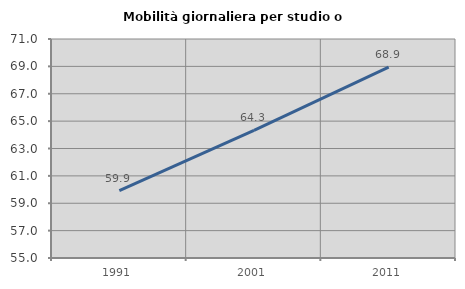
| Category | Mobilità giornaliera per studio o lavoro |
|---|---|
| 1991.0 | 59.914 |
| 2001.0 | 64.329 |
| 2011.0 | 68.942 |